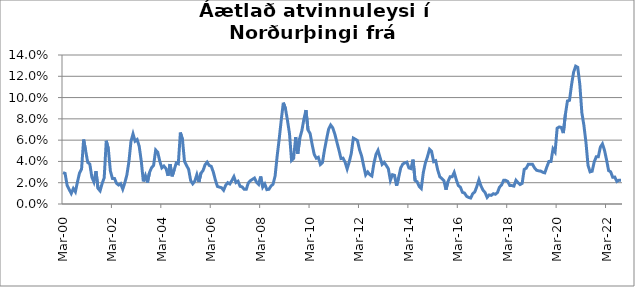
| Category | Series 0 |
|---|---|
| 2000-03-01 | 0.03 |
| 2000-04-01 | 0.029 |
| 2000-05-01 | 0.017 |
| 2000-06-01 | 0.014 |
| 2000-07-01 | 0.01 |
| 2000-08-01 | 0.015 |
| 2000-09-01 | 0.011 |
| 2000-10-01 | 0.021 |
| 2000-11-01 | 0.029 |
| 2000-12-01 | 0.033 |
| 2001-01-01 | 0.061 |
| 2001-02-01 | 0.05 |
| 2001-03-01 | 0.039 |
| 2001-04-01 | 0.038 |
| 2001-05-01 | 0.025 |
| 2001-06-01 | 0.021 |
| 2001-07-01 | 0.031 |
| 2001-08-01 | 0.015 |
| 2001-09-01 | 0.012 |
| 2001-10-01 | 0.019 |
| 2001-11-01 | 0.025 |
| 2001-12-01 | 0.059 |
| 2002-01-01 | 0.052 |
| 2002-02-01 | 0.031 |
| 2002-03-01 | 0.024 |
| 2002-04-01 | 0.024 |
| 2002-05-01 | 0.019 |
| 2002-06-01 | 0.018 |
| 2002-07-01 | 0.019 |
| 2002-08-01 | 0.014 |
| 2002-09-01 | 0.02 |
| 2002-10-01 | 0.027 |
| 2002-11-01 | 0.04 |
| 2002-12-01 | 0.059 |
| 2003-01-01 | 0.066 |
| 2003-02-01 | 0.059 |
| 2003-03-01 | 0.061 |
| 2003-04-01 | 0.054 |
| 2003-05-01 | 0.04 |
| 2003-06-01 | 0.021 |
| 2003-07-01 | 0.027 |
| 2003-08-01 | 0.02 |
| 2003-09-01 | 0.03 |
| 2003-10-01 | 0.034 |
| 2003-11-01 | 0.036 |
| 2003-12-01 | 0.051 |
| 2004-01-01 | 0.049 |
| 2004-02-01 | 0.04 |
| 2004-03-01 | 0.034 |
| 2004-04-01 | 0.036 |
| 2004-05-01 | 0.033 |
| 2004-06-01 | 0.027 |
| 2004-07-01 | 0.037 |
| 2004-08-01 | 0.026 |
| 2004-09-01 | 0.032 |
| 2004-10-01 | 0.039 |
| 2004-11-01 | 0.038 |
| 2004-12-01 | 0.067 |
| 2005-01-01 | 0.061 |
| 2005-02-01 | 0.04 |
| 2005-03-01 | 0.036 |
| 2005-04-01 | 0.033 |
| 2005-05-01 | 0.022 |
| 2005-06-01 | 0.019 |
| 2005-07-01 | 0.021 |
| 2005-08-01 | 0.028 |
| 2005-09-01 | 0.021 |
| 2005-10-01 | 0.029 |
| 2005-11-01 | 0.031 |
| 2005-12-01 | 0.037 |
| 2006-01-01 | 0.039 |
| 2006-02-01 | 0.036 |
| 2006-03-01 | 0.035 |
| 2006-04-01 | 0.03 |
| 2006-05-01 | 0.022 |
| 2006-06-01 | 0.016 |
| 2006-07-01 | 0.016 |
| 2006-08-01 | 0.015 |
| 2006-09-01 | 0.013 |
| 2006-10-01 | 0.018 |
| 2006-11-01 | 0.02 |
| 2006-12-01 | 0.019 |
| 2007-01-01 | 0.022 |
| 2007-02-01 | 0.026 |
| 2007-03-01 | 0.02 |
| 2007-04-01 | 0.021 |
| 2007-05-01 | 0.017 |
| 2007-06-01 | 0.016 |
| 2007-07-01 | 0.014 |
| 2007-08-01 | 0.014 |
| 2007-09-01 | 0.02 |
| 2007-10-01 | 0.022 |
| 2007-11-01 | 0.023 |
| 2007-12-01 | 0.024 |
| 2008-01-01 | 0.02 |
| 2008-02-01 | 0.018 |
| 2008-03-01 | 0.026 |
| 2008-04-01 | 0.016 |
| 2008-05-01 | 0.019 |
| 2008-06-01 | 0.014 |
| 2008-07-01 | 0.014 |
| 2008-08-01 | 0.017 |
| 2008-09-01 | 0.019 |
| 2008-10-01 | 0.026 |
| 2008-11-01 | 0.045 |
| 2008-12-01 | 0.061 |
| 2009-01-01 | 0.079 |
| 2009-02-01 | 0.095 |
| 2009-03-01 | 0.09 |
| 2009-04-01 | 0.079 |
| 2009-05-01 | 0.066 |
| 2009-06-01 | 0.041 |
| 2009-07-01 | 0.043 |
| 2009-08-01 | 0.063 |
| 2009-09-01 | 0.047 |
| 2009-10-01 | 0.062 |
| 2009-11-01 | 0.069 |
| 2009-12-01 | 0.08 |
| 2010-01-01 | 0.088 |
| 2010-02-01 | 0.07 |
| 2010-03-01 | 0.066 |
| 2010-04-01 | 0.056 |
| 2010-05-01 | 0.047 |
| 2010-06-01 | 0.043 |
| 2010-07-01 | 0.044 |
| 2010-08-01 | 0.037 |
| 2010-09-01 | 0.039 |
| 2010-10-01 | 0.051 |
| 2010-11-01 | 0.061 |
| 2010-12-01 | 0.07 |
| 2011-01-01 | 0.074 |
| 2011-02-01 | 0.072 |
| 2011-03-01 | 0.066 |
| 2011-04-01 | 0.058 |
| 2011-05-01 | 0.051 |
| 2011-06-01 | 0.043 |
| 2011-07-01 | 0.043 |
| 2011-08-01 | 0.039 |
| 2011-09-01 | 0.033 |
| 2011-10-01 | 0.039 |
| 2011-11-01 | 0.047 |
| 2011-12-01 | 0.062 |
| 2012-01-01 | 0.061 |
| 2012-02-01 | 0.06 |
| 2012-03-01 | 0.051 |
| 2012-04-01 | 0.045 |
| 2012-05-01 | 0.036 |
| 2012-06-01 | 0.027 |
| 2012-07-01 | 0.03 |
| 2012-08-01 | 0.028 |
| 2012-09-01 | 0.026 |
| 2012-10-01 | 0.038 |
| 2012-11-01 | 0.046 |
| 2012-12-01 | 0.05 |
| 2013-01-01 | 0.044 |
| 2013-02-01 | 0.037 |
| 2013-03-01 | 0.039 |
| 2013-04-01 | 0.036 |
| 2013-05-01 | 0.033 |
| 2013-06-01 | 0.022 |
| 2013-07-01 | 0.028 |
| 2013-08-01 | 0.027 |
| 2013-09-01 | 0.017 |
| 2013-10-01 | 0.025 |
| 2013-11-01 | 0.034 |
| 2013-12-01 | 0.038 |
| 2014-01-01 | 0.039 |
| 2014-02-01 | 0.039 |
| 2014-03-01 | 0.034 |
| 2014-04-01 | 0.033 |
| 2014-05-01 | 0.042 |
| 2014-06-01 | 0.022 |
| 2014-07-01 | 0.021 |
| 2014-08-01 | 0.016 |
| 2014-09-01 | 0.015 |
| 2014-10-01 | 0.03 |
| 2014-11-01 | 0.039 |
| 2014-12-01 | 0.044 |
| 2015-01-01 | 0.051 |
| 2015-02-01 | 0.049 |
| 2015-03-01 | 0.04 |
| 2015-04-01 | 0.041 |
| 2015-05-01 | 0.032 |
| 2015-06-01 | 0.026 |
| 2015-07-01 | 0.024 |
| 2015-08-01 | 0.022 |
| 2015-09-01 | 0.013 |
| 2015-10-01 | 0.021 |
| 2015-11-01 | 0.026 |
| 2015-12-01 | 0.026 |
| 2016-01-01 | 0.03 |
| 2016-02-01 | 0.023 |
| 2016-03-01 | 0.017 |
| 2016-04-01 | 0.016 |
| 2016-05-01 | 0.011 |
| 2016-06-01 | 0.01 |
| 2016-07-01 | 0.007 |
| 2016-08-01 | 0.006 |
| 2016-09-01 | 0.006 |
| 2016-10-01 | 0.01 |
| 2016-11-01 | 0.011 |
| 2016-12-01 | 0.016 |
| 2017-01-01 | 0.023 |
| 2017-02-01 | 0.017 |
| 2017-03-01 | 0.013 |
| 2017-04-01 | 0.011 |
| 2017-05-01 | 0.006 |
| 2017-06-01 | 0.008 |
| 2017-07-01 | 0.008 |
| 2017-08-01 | 0.01 |
| 2017-09-01 | 0.009 |
| 2017-10-01 | 0.011 |
| 2017-11-01 | 0.016 |
| 2017-12-01 | 0.018 |
| 2018-01-01 | 0.022 |
| 2018-02-01 | 0.022 |
| 2018-03-01 | 0.021 |
| 2018-04-01 | 0.017 |
| 2018-05-01 | 0.017 |
| 2018-06-01 | 0.017 |
| 2018-07-01 | 0.022 |
| 2018-08-01 | 0.02 |
| 2018-09-01 | 0.018 |
| 2018-10-01 | 0.019 |
| 2018-11-01 | 0.033 |
| 2018-12-01 | 0.034 |
| 2019-01-01 | 0.037 |
| 2019-02-01 | 0.037 |
| 2019-03-01 | 0.037 |
| 2019-04-01 | 0.034 |
| 2019-05-01 | 0.032 |
| 2019-06-01 | 0.031 |
| 2019-07-01 | 0.031 |
| 2019-08-01 | 0.03 |
| 2019-09-01 | 0.029 |
| 2019-10-01 | 0.035 |
| 2019-11-01 | 0.04 |
| 2019-12-01 | 0.04 |
| 2020-01-01 | 0.052 |
| 2020-02-01 | 0.049 |
| 2020-03-01 | 0.071 |
| 2020-04-01 | 0.072 |
| 2020-05-01 | 0.072 |
| 2020-06-01 | 0.067 |
| 2020-07-01 | 0.084 |
| 2020-08-01 | 0.097 |
| 2020-09-01 | 0.097 |
| 2020-10-01 | 0.112 |
| 2020-11-01 | 0.124 |
| 2020-12-01 | 0.13 |
| 2021-01-01 | 0.128 |
| 2021-02-01 | 0.113 |
| 2021-03-01 | 0.086 |
| 2021-04-01 | 0.074 |
| 2021-05-01 | 0.058 |
| 2021-06-01 | 0.036 |
| 2021-07-01 | 0.03 |
| 2021-08-01 | 0.031 |
| 2021-09-01 | 0.039 |
| 2021-10-01 | 0.044 |
| 2021-11-01 | 0.044 |
| 2021-12-01 | 0.053 |
| 2022-01-01 | 0.056 |
| 2022-02-01 | 0.05 |
| 2022-03-01 | 0.041 |
| 2022-04-01 | 0.031 |
| 2022-05-01 | 0.03 |
| 2022-06-01 | 0.025 |
| 2022-07-01 | 0.025 |
| 2022-08-01 | 0.021 |
| 2022-09-01 | 0.022 |
| 2022-10-01 | 0.022 |